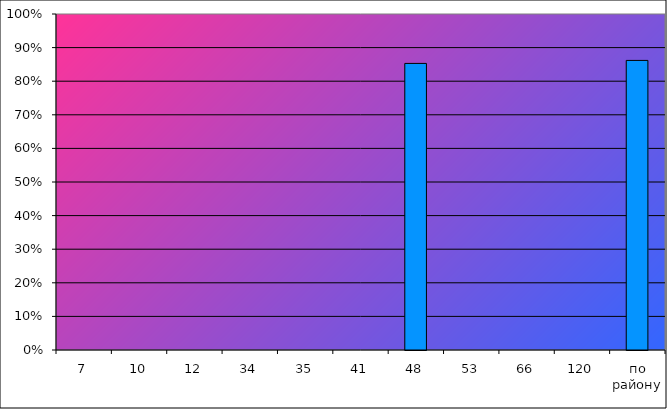
| Category | Series 0 |
|---|---|
| 7 | 0 |
| 10 | 0 |
| 12 | 0 |
| 34 | 0 |
| 35 | 0 |
| 41 | 0 |
| 48 | 0.853 |
| 53 | 0 |
| 66 | 0 |
| 120 | 0 |
| по району | 0.862 |